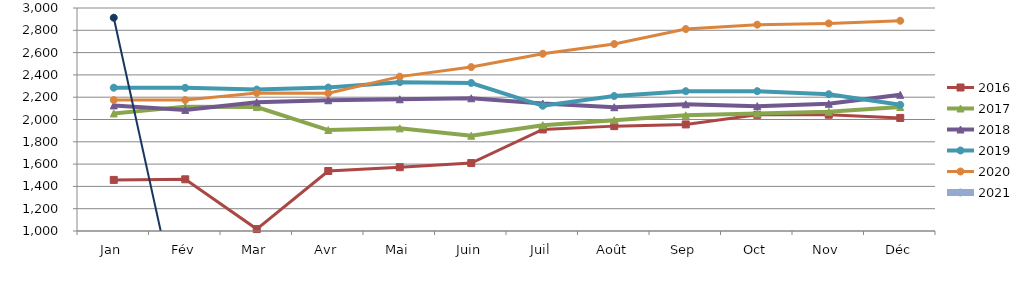
| Category | 2015 | 2016 | 2017 | 2018 | 2019 | 2020 | 2021 |
|---|---|---|---|---|---|---|---|
| Jan |  | 1458.367 | 2054.548 | 2126.43 | 2285.077 | 2174.068 | 2912.819 |
| Fév |  | 1463.569 | 2115.464 | 2086.116 | 2284.041 | 2173.963 | 0 |
| Mar |  | 1017.2 | 2111.342 | 2154.19 | 2268.401 | 2238.064 | 0 |
| Avr |  | 1538.072 | 1905.351 | 2172.692 | 2286.951 | 2235.688 | 0 |
| Mai |  | 1572.182 | 1920.479 | 2181.426 | 2334.869 | 2384.721 | 0 |
| Juin |  | 1609.355 | 1854.713 | 2190.216 | 2327.493 | 2470.094 | 0 |
| Juil |  | 1910.74 | 1949.204 | 2142.84 | 2123.041 | 2589.895 | 0 |
| Août |  | 1940.578 | 1993.991 | 2110.076 | 2210.394 | 2677.173 | 0 |
| Sep |  | 1955.778 | 2037.81 | 2137.072 | 2253.916 | 2811.251 | 0 |
| Oct |  | 2041.667 | 2053.581 | 2119.873 | 2254.192 | 2850.494 | 0 |
| Nov |  | 2042.699 | 2069.345 | 2140.872 | 2226.879 | 2862.02 | 0 |
| Déc |  | 2013.752 | 2111.996 | 2221.568 | 2131.58 | 2885.572 | 0 |